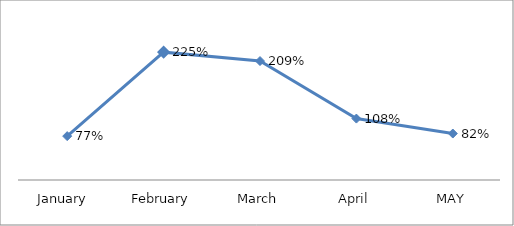
| Category | PERCENTAGE |
|---|---|
| January  | 0.773 |
| February | 2.251 |
| March | 2.094 |
| April | 1.081 |
| MAY | 0.818 |